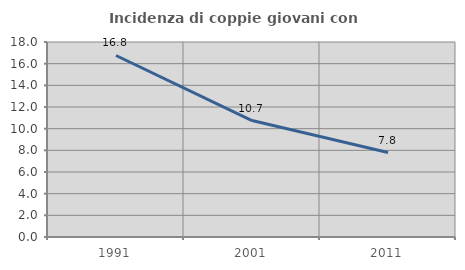
| Category | Incidenza di coppie giovani con figli |
|---|---|
| 1991.0 | 16.754 |
| 2001.0 | 10.748 |
| 2011.0 | 7.792 |